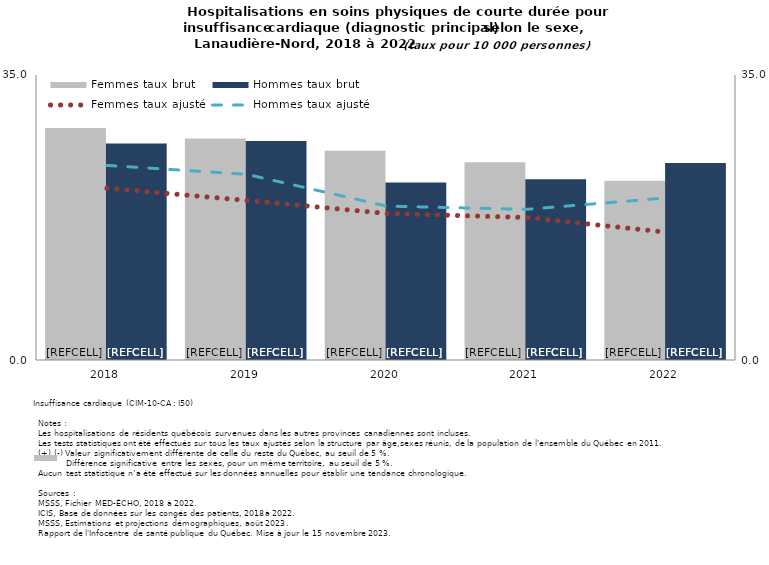
| Category | Femmes taux brut | Hommes taux brut |
|---|---|---|
| 2018.0 | 28.5 | 26.6 |
| 2019.0 | 27.2 | 26.9 |
| 2020.0 | 25.7 | 21.8 |
| 2021.0 | 24.3 | 22.2 |
| 2022.0 | 22 | 24.2 |